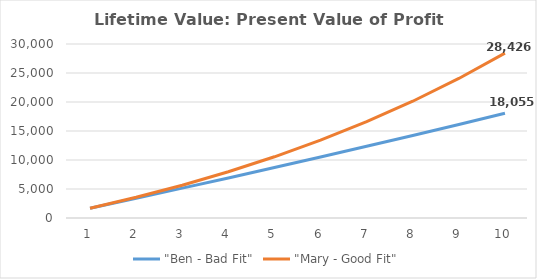
| Category | "Ben - Bad Fit" | "Mary - Good Fit" |
|---|---|---|
| 0 | 1690.821 | 1690.821 |
| 1 | 3406.147 | 3569.512 |
| 2 | 5146.333 | 5656.945 |
| 3 | 6911.739 | 7976.316 |
| 4 | 8702.73 | 10553.394 |
| 5 | 10519.678 | 13416.815 |
| 6 | 12362.958 | 16598.394 |
| 7 | 14232.953 | 20133.481 |
| 8 | 16130.049 | 24061.356 |
| 9 | 18054.639 | 28425.661 |